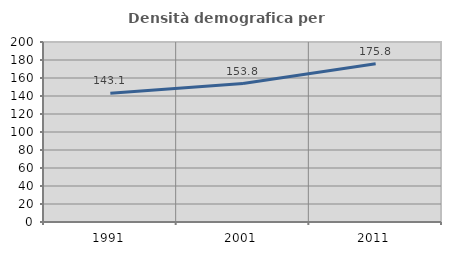
| Category | Densità demografica |
|---|---|
| 1991.0 | 143.088 |
| 2001.0 | 153.799 |
| 2011.0 | 175.846 |